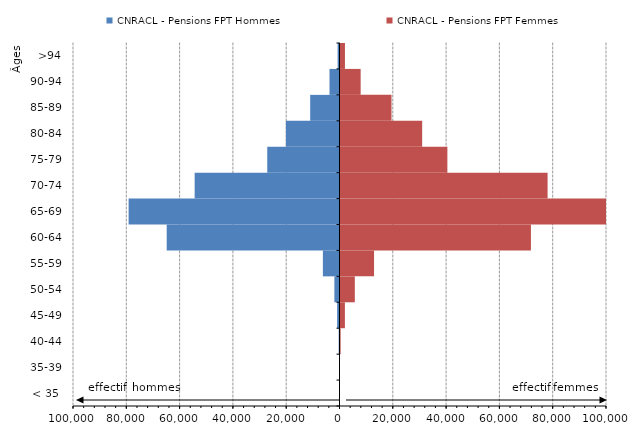
| Category | CNRACL - Pensions FPT Hommes | CNRACL - Pensions FPT Femmes |
|---|---|---|
| < 35  | -30 | 27 |
| 35-39 | -100 | 151 |
| 40-44 | -303 | 432 |
| 45-49 | -887 | 2029 |
| 50-54 | -1923 | 5751 |
| 55-59 | -6238 | 12962 |
| 60-64 | -64838 | 71830 |
| 65-69 | -79131 | 108953 |
| 70-74 | -54352 | 78079 |
| 75-79 | -27113 | 40479 |
| 80-84 | -20113 | 31017 |
| 85-89 | -11003 | 19505 |
| 90-94 | -3754 | 7936 |
| >94 | -700 | 2045 |